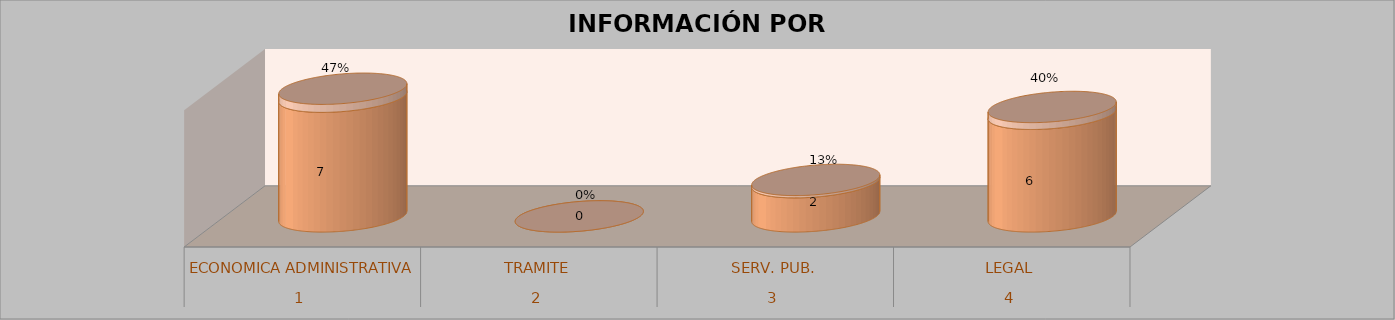
| Category | Series 0 | Series 1 | Series 2 | Series 3 |
|---|---|---|---|---|
| 0 |  |  | 7 | 0.467 |
| 1 |  |  | 0 | 0 |
| 2 |  |  | 2 | 0.133 |
| 3 |  |  | 6 | 0.4 |